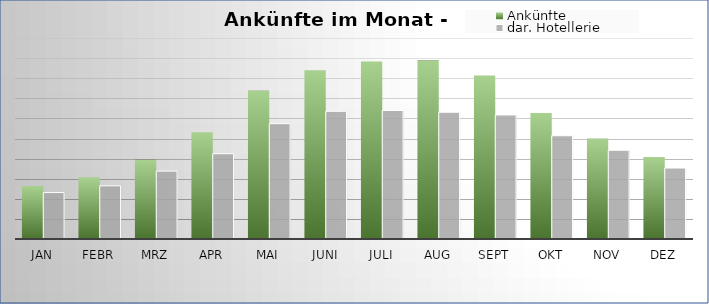
| Category | Ankünfte | dar. Hotellerie |
|---|---|---|
| Jan | 5285 | 4619 |
| Febr | 6137 | 5291 |
| Mrz | 7875 | 6754 |
| Apr | 10626 | 8488 |
| Mai | 14763 | 11475 |
| Juni | 16798 | 12707 |
| Juli | 17669 | 12786 |
| Aug | 17751 | 12615 |
| Sept | 16275 | 12343 |
| Okt | 12525 | 10276 |
| Nov | 9978 | 8831 |
| Dez | 8153 | 7061 |